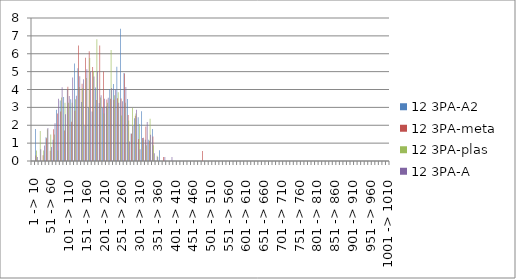
| Category | 12 3PA-A2 | 12 3PA-meta | 12 3PA-plas | 12 3PA-A |
|---|---|---|---|---|
| 1 -> 10 | 0 | 0 | 0 | 0 |
| 11 -> 20 | 1.791 | 0.303 | 0.592 | 0.218 |
| 21 -> 30 | 0 | 0 | 1.672 | 0.653 |
| 31 -> 40 | 0 | 0.325 | 0.592 | 0.871 |
| 41 -> 50 | 1.332 | 1.278 | 1.775 | 1.851 |
| 51 -> 60 | 0 | 0.566 | 1.479 | 0.784 |
| 61 -> 70 | 1.194 | 1.78 | 1.479 | 2.116 |
| 71 -> 80 | 2.869 | 2.652 | 0.592 | 3.483 |
| 81 -> 90 | 3.379 | 2.773 | 3.551 | 4.13 |
| 91 -> 100 | 3.583 | 1.699 | 3.255 | 2.612 |
| 101 -> 110 | 3.978 | 4.156 | 3.255 | 3.634 |
| 111 -> 120 | 3.456 | 2.189 | 3.255 | 4.673 |
| 121 -> 130 | 5.452 | 2.811 | 3.457 | 3.649 |
| 131 -> 140 | 5.182 | 6.465 | 4.142 | 4.738 |
| 141 -> 150 | 3.306 | 4.328 | 4.075 | 4.571 |
| 151 -> 160 | 1.955 | 5.776 | 4.647 | 5.132 |
| 161 -> 170 | 2.99 | 6.135 | 5.759 | 5.014 |
| 171 -> 180 | 2.776 | 5.264 | 5.03 | 4.733 |
| 181 -> 190 | 4.116 | 3.41 | 6.806 | 5.025 |
| 191 -> 200 | 3.251 | 6.457 | 3.551 | 3.674 |
| 201 -> 210 | 2.986 | 5.012 | 2.663 | 3.483 |
| 211 -> 220 | 3.056 | 3.443 | 3.255 | 3.532 |
| 221 -> 230 | 4.024 | 3.487 | 6.206 | 4.084 |
| 231 -> 240 | 4.308 | 3.422 | 3.677 | 3.987 |
| 241 -> 250 | 5.279 | 3.515 | 3.847 | 3.265 |
| 251 -> 260 | 7.404 | 3.502 | 2.547 | 3.344 |
| 261 -> 270 | 4.927 | 4.888 | 3.255 | 4.136 |
| 271 -> 280 | 3.468 | 2.575 | 2.272 | 1.088 |
| 281 -> 290 | 1.532 | 1.524 | 2.959 | 1.959 |
| 291 -> 300 | 2.388 | 2.532 | 2.663 | 2.865 |
| 301 -> 310 | 2.452 | 1.23 | 2.071 | 0.653 |
| 311 -> 320 | 2.787 | 1.28 | 1.184 | 1.306 |
| 321 -> 330 | 1.194 | 1.933 | 0.888 | 2.177 |
| 331 -> 340 | 1.194 | 1.133 | 2.367 | 1.475 |
| 341 -> 350 | 1.791 | 1.367 | 0.888 | 0.435 |
| 351 -> 360 | 0 | 0 | 0.295 | 0.218 |
| 361 -> 370 | 0.596 | 0 | 0 | 0 |
| 371 -> 380 | 0 | 0.221 | 0 | 0.218 |
| 381 -> 390 | 0 | 0 | 0 | 0 |
| 391 -> 400 | 0 | 0 | 0 | 0.217 |
| 401 -> 410 | 0 | 0 | 0 | 0 |
| 411 -> 420 | 0 | 0 | 0 | 0 |
| 421 -> 430 | 0 | 0 | 0 | 0 |
| 431 -> 440 | 0 | 0 | 0 | 0 |
| 441 -> 450 | 0 | 0 | 0 | 0 |
| 451 -> 460 | 0 | 0 | 0 | 0 |
| 461 -> 470 | 0 | 0 | 0 | 0 |
| 471 -> 480 | 0 | 0 | 0 | 0 |
| 481 -> 490 | 0 | 0.565 | 0 | 0 |
| 491 -> 500 | 0 | 0 | 0 | 0 |
| 501 -> 510 | 0 | 0 | 0 | 0 |
| 511 -> 520 | 0 | 0 | 0 | 0 |
| 521 -> 530 | 0 | 0 | 0 | 0 |
| 531 -> 540 | 0 | 0 | 0 | 0 |
| 541 -> 550 | 0 | 0 | 0 | 0 |
| 551 -> 560 | 0 | 0 | 0 | 0 |
| 561 -> 570 | 0 | 0 | 0 | 0 |
| 571 -> 580 | 0 | 0 | 0 | 0 |
| 581 -> 590 | 0 | 0 | 0 | 0 |
| 591 -> 600 | 0 | 0 | 0 | 0 |
| 601 -> 610 | 0 | 0 | 0 | 0 |
| 611 -> 620 | 0 | 0 | 0 | 0 |
| 621 -> 630 | 0 | 0 | 0 | 0 |
| 631 -> 640 | 0 | 0 | 0 | 0 |
| 641 -> 650 | 0 | 0 | 0 | 0 |
| 651 -> 660 | 0 | 0 | 0 | 0 |
| 661 -> 670 | 0 | 0 | 0 | 0 |
| 671 -> 680 | 0 | 0 | 0 | 0 |
| 681 -> 690 | 0 | 0 | 0 | 0 |
| 691 -> 700 | 0 | 0 | 0 | 0 |
| 701 -> 710 | 0 | 0 | 0 | 0 |
| 711 -> 720 | 0 | 0 | 0 | 0 |
| 721 -> 730 | 0 | 0 | 0 | 0 |
| 731 -> 740 | 0 | 0 | 0 | 0 |
| 741 -> 750 | 0 | 0 | 0 | 0 |
| 751 -> 760 | 0 | 0 | 0 | 0 |
| 761 -> 770 | 0 | 0 | 0 | 0 |
| 771 -> 780 | 0 | 0 | 0 | 0 |
| 781 -> 790 | 0 | 0 | 0 | 0 |
| 791 -> 800 | 0 | 0 | 0 | 0 |
| 801 -> 810 | 0 | 0 | 0 | 0 |
| 811 -> 820 | 0 | 0 | 0 | 0 |
| 821 -> 830 | 0 | 0 | 0 | 0 |
| 831 -> 840 | 0 | 0 | 0 | 0 |
| 841 -> 850 | 0 | 0 | 0 | 0 |
| 851 -> 860 | 0 | 0 | 0 | 0 |
| 861 -> 870 | 0 | 0 | 0 | 0 |
| 871 -> 880 | 0 | 0 | 0 | 0 |
| 881 -> 890 | 0 | 0 | 0 | 0 |
| 891 -> 900 | 0 | 0 | 0 | 0 |
| 901 -> 910 | 0 | 0 | 0 | 0 |
| 911 -> 920 | 0 | 0 | 0 | 0 |
| 921 -> 930 | 0 | 0 | 0 | 0 |
| 931 -> 940 | 0 | 0 | 0 | 0 |
| 941 -> 950 | 0 | 0 | 0 | 0 |
| 951 -> 960 | 0 | 0 | 0 | 0 |
| 961 -> 970 | 0 | 0 | 0 | 0 |
| 971 -> 980 | 0 | 0 | 0 | 0 |
| 981 -> 990 | 0 | 0 | 0 | 0 |
| 991 -> 1000 | 0 | 0 | 0 | 0 |
| 1001 -> 1010 | 0 | 0 | 0 | 0 |